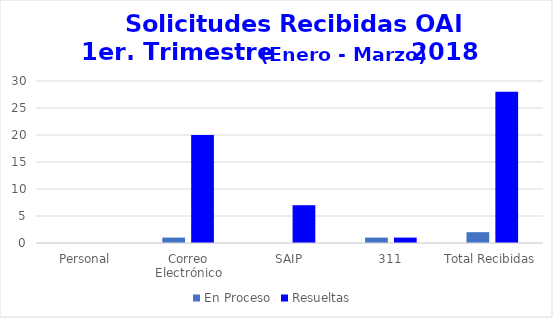
| Category | En Proceso | Resueltas  |
|---|---|---|
| Personal | 0 | 0 |
| Correo Electrónico | 1 | 20 |
| SAIP | 0 | 7 |
| 311 | 1 | 1 |
| Total Recibidas | 2 | 28 |